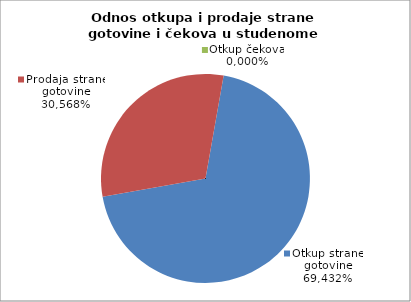
| Category | Otkup strane gotovine |
|---|---|
| 0 | 0.694 |
| 1 | 0.306 |
| 2 | 0 |